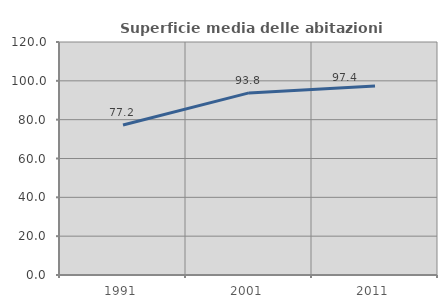
| Category | Superficie media delle abitazioni occupate |
|---|---|
| 1991.0 | 77.239 |
| 2001.0 | 93.778 |
| 2011.0 | 97.361 |